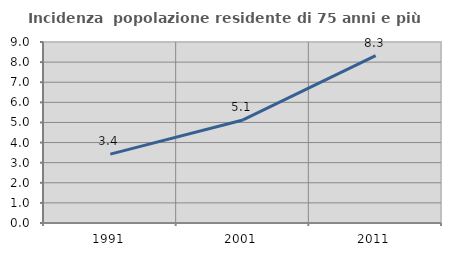
| Category | Incidenza  popolazione residente di 75 anni e più |
|---|---|
| 1991.0 | 3.423 |
| 2001.0 | 5.125 |
| 2011.0 | 8.319 |